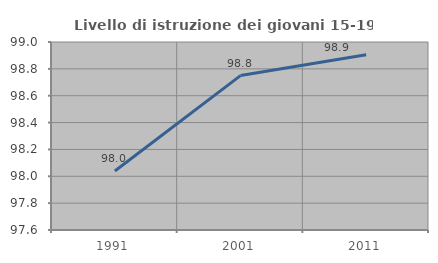
| Category | Livello di istruzione dei giovani 15-19 anni |
|---|---|
| 1991.0 | 98.039 |
| 2001.0 | 98.75 |
| 2011.0 | 98.905 |